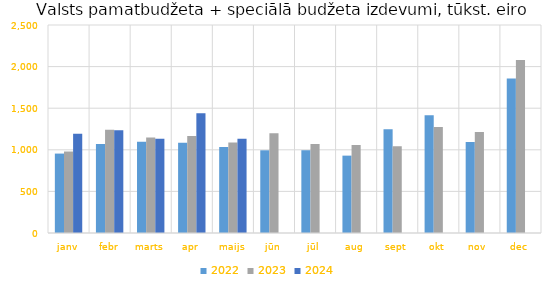
| Category | 2022 | 2023 | 2024 |
|---|---|---|---|
| janv | 954604.585 | 979490.845 | 1193977.049 |
| febr | 1070533.109 | 1241845.152 | 1234636.197 |
| marts | 1096177.665 | 1147758.348 | 1132798.622 |
| apr | 1085060.388 | 1165647.249 | 1438314.584 |
| maijs | 1032376.247 | 1086477.037 | 1133118.651 |
| jūn | 994027.105 | 1200332.508 | 0 |
| jūl | 994781.699 | 1069038.771 | 0 |
| aug | 929865.805 | 1059055.24 | 0 |
| sept | 1247630.19 | 1042251.968 | 0 |
| okt | 1415572.01 | 1274735.47 | 0 |
| nov | 1092974.61 | 1214492.205 | 0 |
| dec | 1857192.044 | 2078569.315 | 0 |